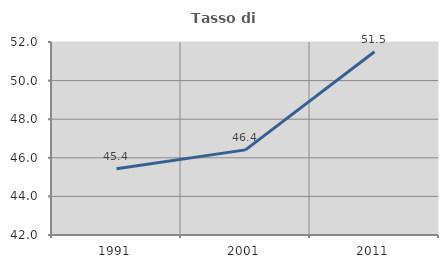
| Category | Tasso di occupazione   |
|---|---|
| 1991.0 | 45.429 |
| 2001.0 | 46.41 |
| 2011.0 | 51.496 |